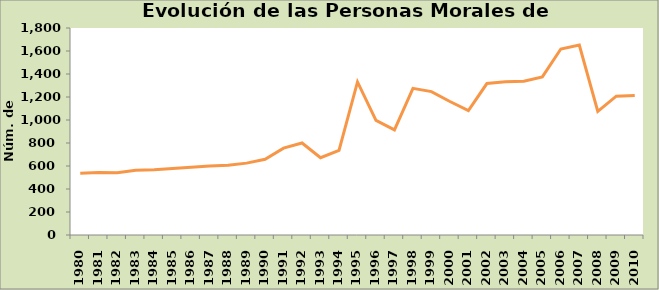
| Category | Series 0 |
|---|---|
| 1980.0 | 537 |
| 1981.0 | 543 |
| 1982.0 | 541 |
| 1983.0 | 563 |
| 1984.0 | 568 |
| 1985.0 | 579 |
| 1986.0 | 589 |
| 1987.0 | 599 |
| 1988.0 | 607 |
| 1989.0 | 625 |
| 1990.0 | 658 |
| 1991.0 | 755 |
| 1992.0 | 800 |
| 1993.0 | 672 |
| 1994.0 | 736 |
| 1995.0 | 1331 |
| 1996.0 | 996 |
| 1997.0 | 914 |
| 1998.0 | 1275 |
| 1999.0 | 1247 |
| 2000.0 | 1161 |
| 2001.0 | 1082 |
| 2002.0 | 1317 |
| 2003.0 | 1333 |
| 2004.0 | 1337 |
| 2005.0 | 1375 |
| 2006.0 | 1617 |
| 2007.0 | 1652 |
| 2008.0 | 1075 |
| 2009.0 | 1207 |
| 2010.0 | 1213 |